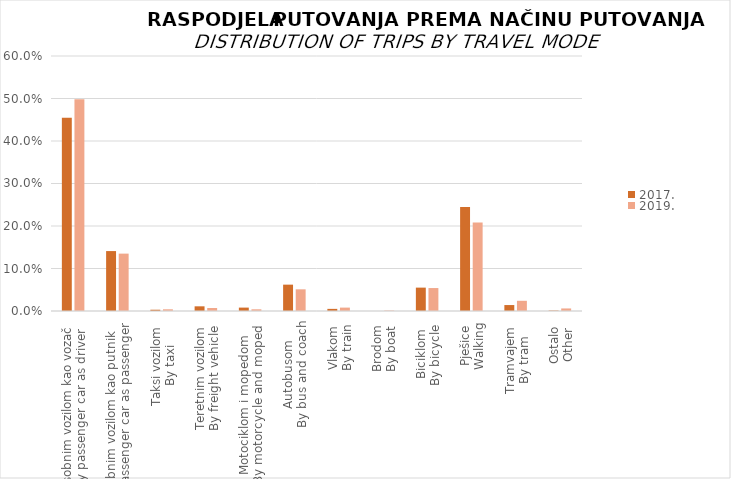
| Category | 2017. | 2019. |
|---|---|---|
| Osobnim vozilom kao vozač
By passenger car as driver | 0.455 | 0.498 |
| Osobnim vozilom kao putnik
By passenger car as passenger | 0.141 | 0.135 |
| Taksi vozilom
By taxi | 0.003 | 0.004 |
| Teretnim vozilom
By freight vehicle | 0.011 | 0.007 |
| Motociklom i mopedom
By motorcycle and moped
 | 0.008 | 0.004 |
| Autobusom
By bus and coach | 0.062 | 0.051 |
| Vlakom
By train | 0.005 | 0.008 |
| Brodom
By boat | 0 | 0.001 |
| Biciklom
By bicycle  | 0.055 | 0.054 |
| Pješice
Walking | 0.245 | 0.208 |
| Tramvajem
By tram | 0.014 | 0.024 |
| Ostalo
Other | 0.001 | 0.006 |